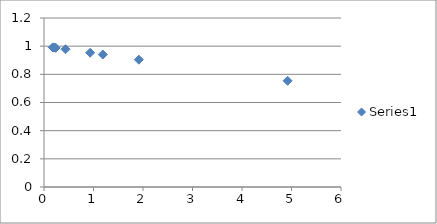
| Category | Series 0 |
|---|---|
| 0.1783562296 | 0.991 |
| 0.1800739333 | 0.991 |
| 0.2023284517 | 0.99 |
| 0.2363361784 | 0.988 |
| 0.4347249805 | 0.978 |
| 0.9334368611 | 0.953 |
| 1.187819058 | 0.941 |
| 1.916281886 | 0.904 |
| 4.920827422 | 0.754 |